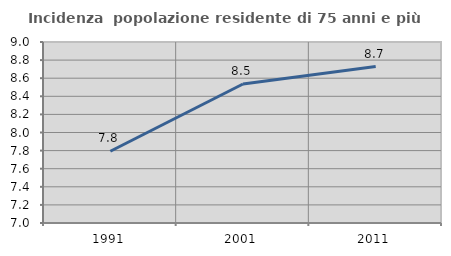
| Category | Incidenza  popolazione residente di 75 anni e più |
|---|---|
| 1991.0 | 7.793 |
| 2001.0 | 8.536 |
| 2011.0 | 8.729 |